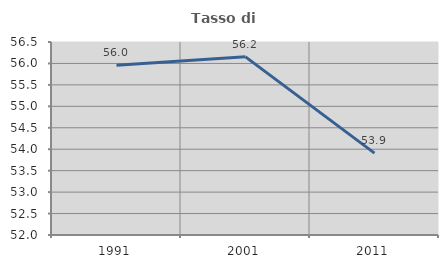
| Category | Tasso di occupazione   |
|---|---|
| 1991.0 | 55.958 |
| 2001.0 | 56.154 |
| 2011.0 | 53.91 |